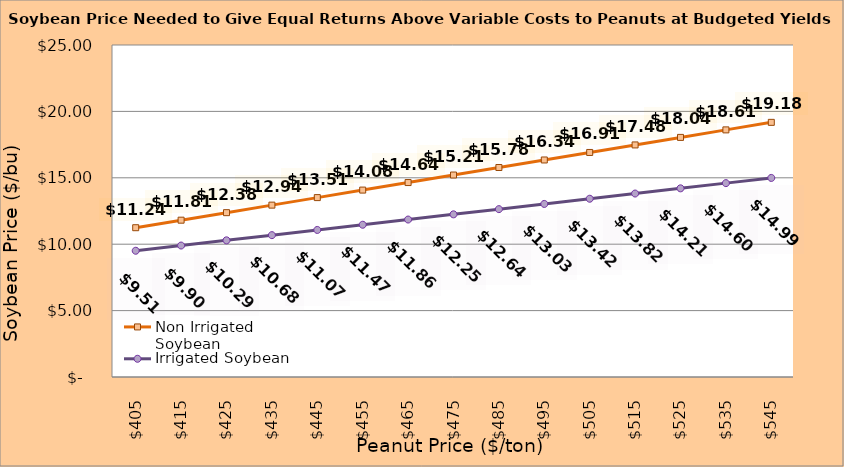
| Category | Non Irrigated Soybean | Irrigated Soybean |
|---|---|---|
| 405.0 | 11.242 | 9.507 |
| 415.0 | 11.809 | 9.898 |
| 425.0 | 12.375 | 10.29 |
| 435.0 | 12.942 | 10.682 |
| 445.0 | 13.509 | 11.073 |
| 455.0 | 14.075 | 11.465 |
| 465.0 | 14.642 | 11.857 |
| 475.0 | 15.209 | 12.248 |
| 485.0 | 15.775 | 12.64 |
| 495.0 | 16.342 | 13.032 |
| 505.0 | 16.909 | 13.423 |
| 515.0 | 17.475 | 13.815 |
| 525.0 | 18.042 | 14.207 |
| 535.0 | 18.609 | 14.598 |
| 545.0 | 19.175 | 14.99 |